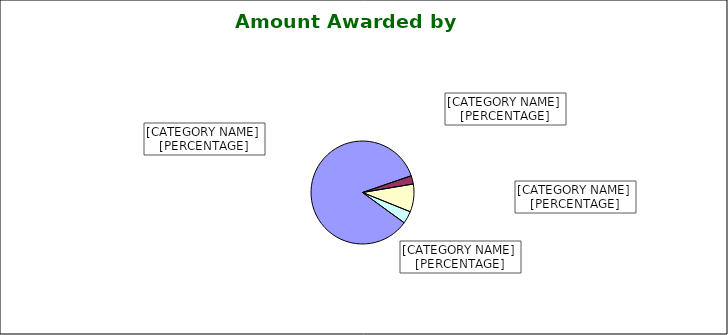
| Category | Series 0 |
|---|---|
| Research $181.4M / | 0.847 |
| Instruction $5.6M / | 0.026 |
| Public Service $18.7M / | 0.087 |
| Extension Service $8.3M / | 0.039 |